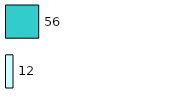
| Category | Series 0 | Series 1 |
|---|---|---|
| 0 | 12 | 56 |